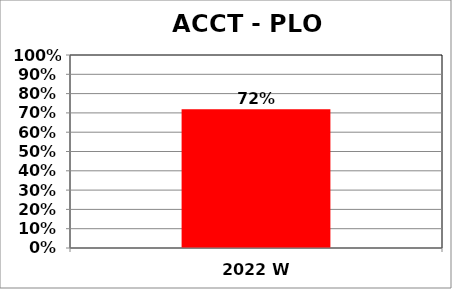
| Category | Series 0 |
|---|---|
| 2022 W | 0.719 |